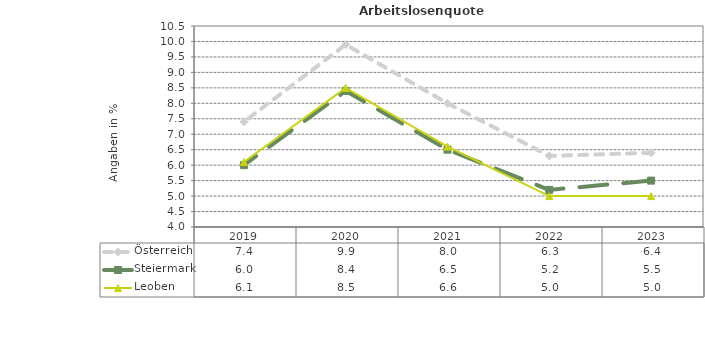
| Category | Österreich | Steiermark | Leoben |
|---|---|---|---|
| 2023.0 | 6.4 | 5.5 | 5 |
| 2022.0 | 6.3 | 5.2 | 5 |
| 2021.0 | 8 | 6.5 | 6.6 |
| 2020.0 | 9.9 | 8.4 | 8.5 |
| 2019.0 | 7.4 | 6 | 6.1 |